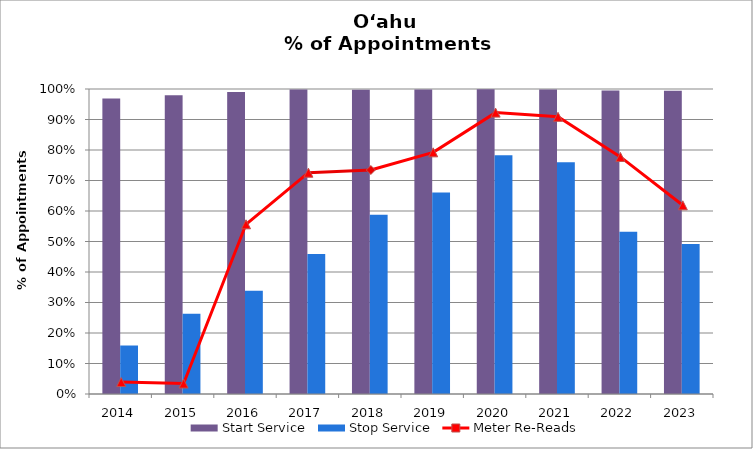
| Category | Start Service | Stop Service |
|---|---|---|
| 2014.0 | 0.969 | 0.159 |
| 2015.0 | 0.979 | 0.263 |
| 2016.0 | 0.99 | 0.338 |
| 2017.0 | 0.999 | 0.459 |
| 2018.0 | 0.997 | 0.588 |
| 2019.0 | 0.998 | 0.66 |
| 2020.0 | 0.999 | 0.783 |
| 2021.0 | 0.998 | 0.76 |
| 2022.0 | 0.995 | 0.532 |
| 2023.0 | 0.994 | 0.492 |